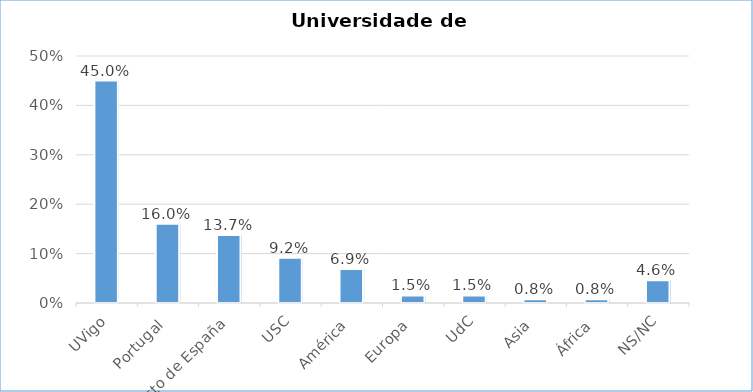
| Category | % Respostas |
|---|---|
| UVigo | 0.45 |
| Portugal | 0.16 |
| Resto de España | 0.137 |
| USC | 0.092 |
| América | 0.069 |
| Europa | 0.015 |
| UdC | 0.015 |
| Asia | 0.008 |
| África | 0.008 |
| NS/NC | 0.046 |